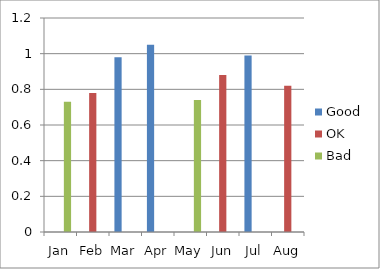
| Category | Good | OK | Bad |
|---|---|---|---|
| Jan | 0 | 0 | 0.73 |
| Feb | 0 | 0.78 | 0 |
| Mar | 0.98 | 0 | 0 |
| Apr | 1.05 | 0 | 0 |
| May | 0 | 0 | 0.74 |
| Jun | 0 | 0.88 | 0 |
| Jul | 0.99 | 0 | 0 |
| Aug | 0 | 0.82 | 0 |